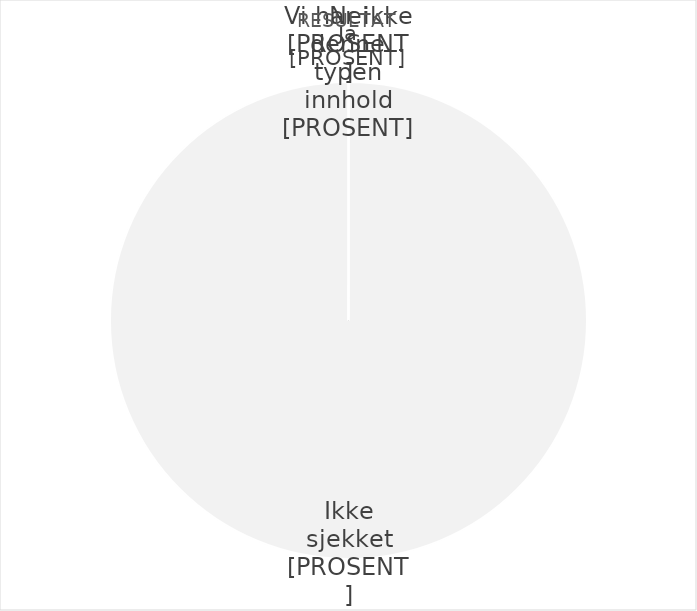
| Category | Series 0 |
|---|---|
| 0 | 0 |
| 1 | 0 |
| 2 | 0 |
| 3 | 41 |